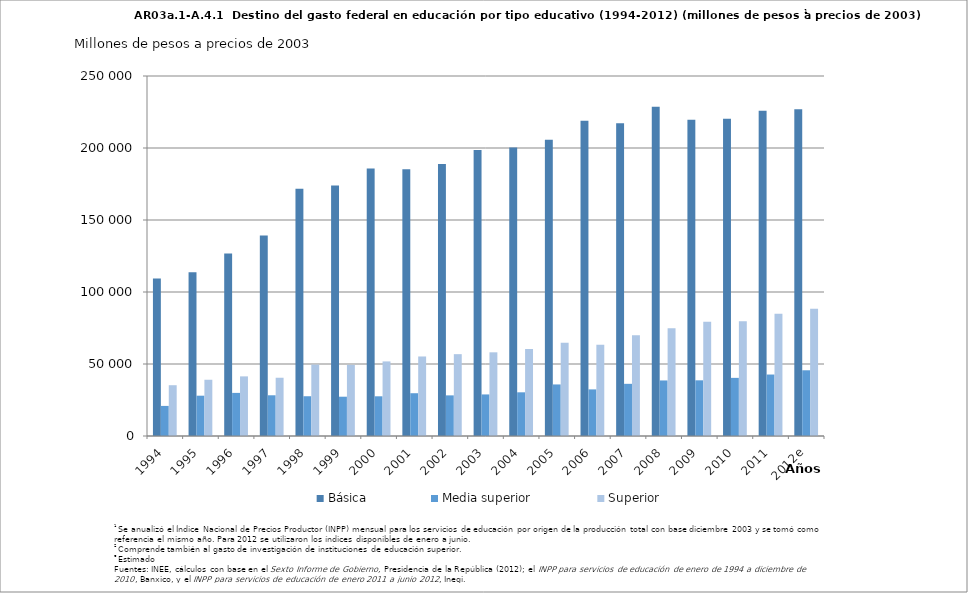
| Category | Básica | Media superior | Superior |
|---|---|---|---|
| 1994 | 109380.359 | 20890.751 | 35267.363 |
| 1995 | 113696.154 | 27992.023 | 39055.723 |
| 1996 | 126692.23 | 29934.043 | 41402.63 |
| 1997 | 139278.428 | 28276.948 | 40456.347 |
| 1998 | 171677.291 | 27614.341 | 49578.676 |
| 1999 | 174005.921 | 27285.983 | 49404.606 |
| 2000 | 185799.018 | 27570.359 | 51789.959 |
| 2001 | 185260.813 | 29708.473 | 55224.988 |
| 2002 | 188838.24 | 28213.563 | 56833.274 |
| 2003 | 198578.623 | 28865.011 | 58114.043 |
| 2004 | 200317.862 | 30338.013 | 60352.112 |
| 2005 | 205760.786 | 35801.498 | 64831.807 |
| 2006 | 218943.855 | 32363.386 | 63345.189 |
| 2007 | 217177.087 | 36231.733 | 69934.085 |
| 2008 | 228726.889 | 38577.318 | 74889.886 |
| 2009 | 219699.897 | 38668.237 | 79259.42 |
| 2010 | 220322.129 | 40371.815 | 79656.589 |
| 2011 | 225803.094 | 42688.364 | 84873.877 |
| 2012e | 226852.116 | 45639.649 | 88328.004 |